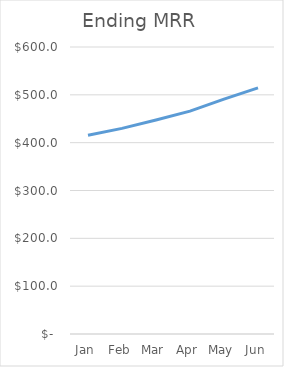
| Category | Ending MRR |
|---|---|
| Jan | 415.6 |
| Feb | 429.872 |
| Mar | 447.494 |
| Apr | 465.887 |
| May | 491.023 |
| Jun | 514.622 |